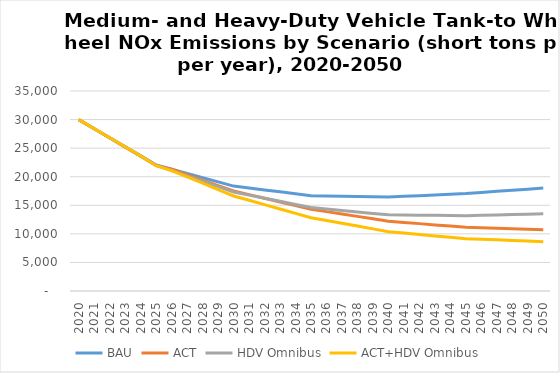
| Category | BAU | ACT | HDV Omnibus | ACT+HDV Omnibus |
|---|---|---|---|---|
| 2020.0 | 29990 | 29990 | 29990 | 29990 |
| 2021.0 | 28400 | 28380 | 28400 | 28400 |
| 2022.0 | 26810 | 26780 | 26810 | 26810 |
| 2023.0 | 25230 | 25170 | 25230 | 25230 |
| 2024.0 | 23640 | 23570 | 23640 | 23640 |
| 2025.0 | 22050 | 21960 | 22020 | 21930 |
| 2026.0 | 21310 | 21310 | 21080 | 21080 |
| 2027.0 | 20570 | 20360 | 20140 | 19970 |
| 2028.0 | 19840 | 19410 | 19210 | 18860 |
| 2029.0 | 19100 | 18450 | 18270 | 17740 |
| 2030.0 | 18360 | 17500 | 17330 | 16630 |
| 2031.0 | 18020 | 16860 | 16780 | 15870 |
| 2032.0 | 17690 | 16220 | 16240 | 15110 |
| 2033.0 | 17350 | 15590 | 15690 | 14350 |
| 2034.0 | 17020 | 14950 | 15150 | 13590 |
| 2035.0 | 16680 | 14310 | 14600 | 12830 |
| 2036.0 | 16630 | 13890 | 14350 | 12340 |
| 2037.0 | 16580 | 13470 | 14090 | 11850 |
| 2038.0 | 16540 | 13060 | 13840 | 11360 |
| 2039.0 | 16490 | 12640 | 13580 | 10870 |
| 2040.0 | 16440 | 12220 | 13330 | 10380 |
| 2041.0 | 16560 | 12000 | 13300 | 10130 |
| 2042.0 | 16690 | 11790 | 13270 | 9890 |
| 2043.0 | 16810 | 11570 | 13250 | 9640 |
| 2044.0 | 16940 | 11360 | 13220 | 9400 |
| 2045.0 | 17060 | 11140 | 13190 | 9150 |
| 2046.0 | 17250 | 11060 | 13250 | 9050 |
| 2047.0 | 17440 | 10980 | 13310 | 8950 |
| 2048.0 | 17630 | 10890 | 13380 | 8840 |
| 2049.0 | 17820 | 10810 | 13440 | 8740 |
| 2050.0 | 18010 | 10730 | 13500 | 8640 |